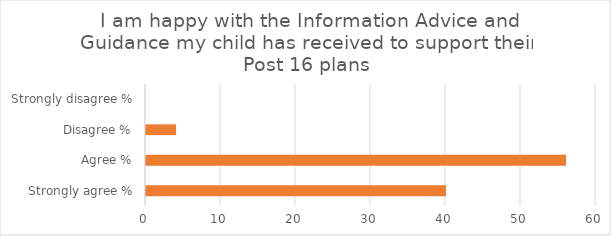
| Category | Series 1 |
|---|---|
| Strongly agree % | 40 |
| Agree % | 56 |
| Disagree % | 4 |
| Strongly disagree % | 0 |